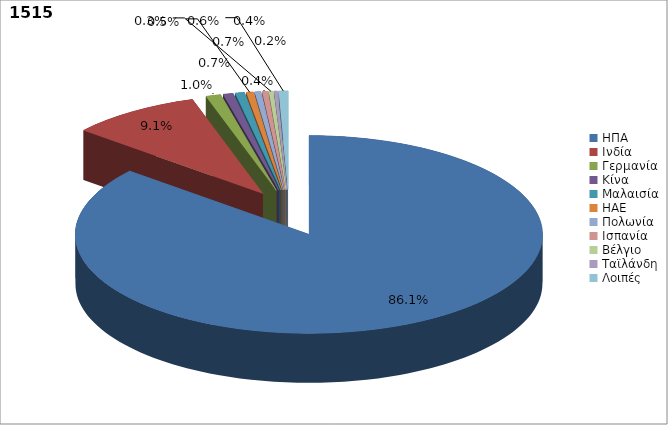
| Category | Series 0 |
|---|---|
| ΗΠΑ | 0.861 |
| Ινδία | 0.091 |
| Γερμανία | 0.01 |
| Κίνα | 0.007 |
| Μαλαισία | 0.007 |
| ΗΑΕ | 0.005 |
| Πολωνία | 0.004 |
| Ισπανία | 0.004 |
| Βέλγιο | 0.003 |
| Ταϊλάνδη | 0.002 |
| Λοιπές | 0.006 |